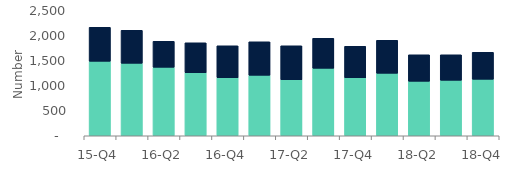
| Category | Homeowners | Buy-to-let |
|---|---|---|
| 15-Q4 | 1490 | 680 |
| 16-Q1 | 1450 | 660 |
| 16-Q2 | 1370 | 520 |
| 16-Q3 | 1260 | 600 |
| 16-Q4 | 1160 | 640 |
| 17-Q1 | 1210 | 670 |
| 17-Q2 | 1120 | 680 |
| 17-Q3 | 1350 | 600 |
| 17-Q4 | 1160 | 630 |
| 18-Q1 | 1250 | 660 |
| 18-Q2 | 1090 | 530 |
| 18-Q3 | 1110 | 510 |
| 18-Q4 | 1130 | 540 |